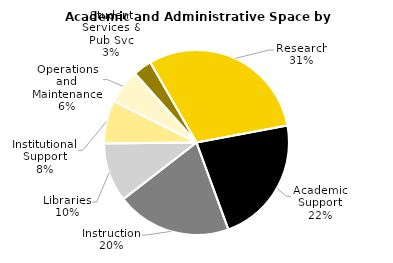
| Category | Series 0 |
|---|---|
| Research | 1564532.51 |
| Academic Support | 1151396.93 |
| Instruction | 1035506.08 |
| Libraries | 532190.76 |
| Institutional Support | 388531.94 |
| Operations and Maintenance | 310228 |
| Student Services & Pub Svc | 167399.39 |